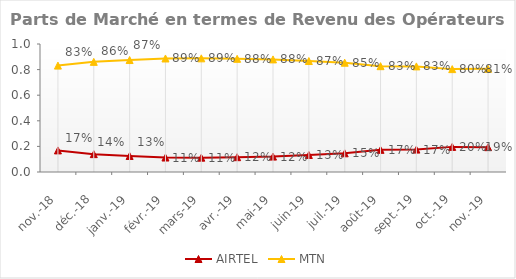
| Category | AIRTEL | MTN |
|---|---|---|
| nov.-18 | 0.169 | 0.831 |
| déc.-18 | 0.14 | 0.86 |
| janv.-19 | 0.125 | 0.875 |
| févr.-19 | 0.113 | 0.887 |
| mars-19 | 0.112 | 0.888 |
| avr.-19 | 0.116 | 0.884 |
| mai-19 | 0.12 | 0.88 |
| juin-19 | 0.133 | 0.867 |
| juil.-19 | 0.146 | 0.854 |
| août-19 | 0.173 | 0.827 |
| sept.-19 | 0.175 | 0.825 |
| oct.-19 | 0.196 | 0.804 |
| nov.-19 | 0.194 | 0.806 |